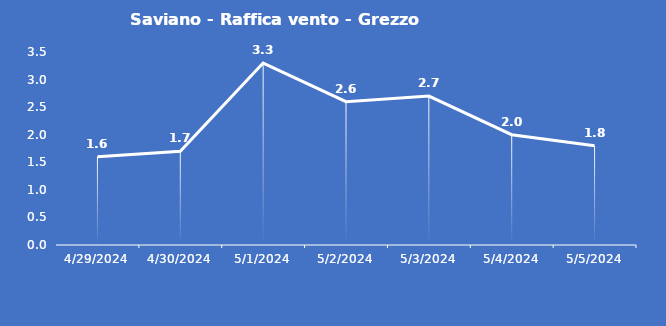
| Category | Saviano - Raffica vento - Grezzo (m/s) |
|---|---|
| 4/29/24 | 1.6 |
| 4/30/24 | 1.7 |
| 5/1/24 | 3.3 |
| 5/2/24 | 2.6 |
| 5/3/24 | 2.7 |
| 5/4/24 | 2 |
| 5/5/24 | 1.8 |